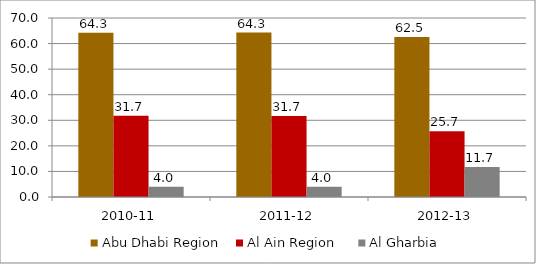
| Category | Abu Dhabi Region  | Al Ain Region    | Al Gharbia |
|---|---|---|---|
| 2010-11 | 64.278 | 31.735 | 3.988 |
| 2011-12 | 64.298 | 31.717 | 3.986 |
| 2012-13 | 62.545 | 25.713 | 11.742 |